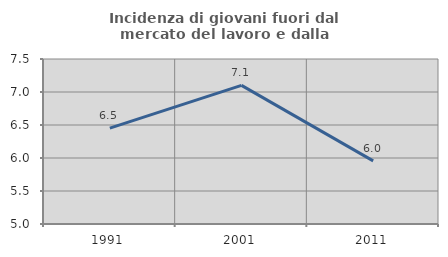
| Category | Incidenza di giovani fuori dal mercato del lavoro e dalla formazione  |
|---|---|
| 1991.0 | 6.452 |
| 2001.0 | 7.101 |
| 2011.0 | 5.956 |